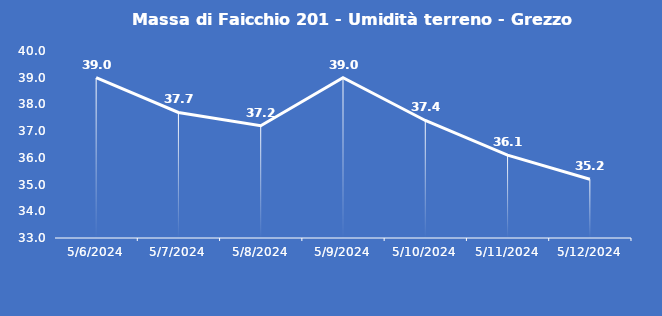
| Category | Massa di Faicchio 201 - Umidità terreno - Grezzo (%VWC) |
|---|---|
| 5/6/24 | 39 |
| 5/7/24 | 37.7 |
| 5/8/24 | 37.2 |
| 5/9/24 | 39 |
| 5/10/24 | 37.4 |
| 5/11/24 | 36.1 |
| 5/12/24 | 35.2 |